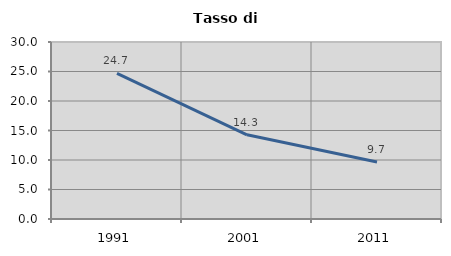
| Category | Tasso di disoccupazione   |
|---|---|
| 1991.0 | 24.688 |
| 2001.0 | 14.264 |
| 2011.0 | 9.657 |